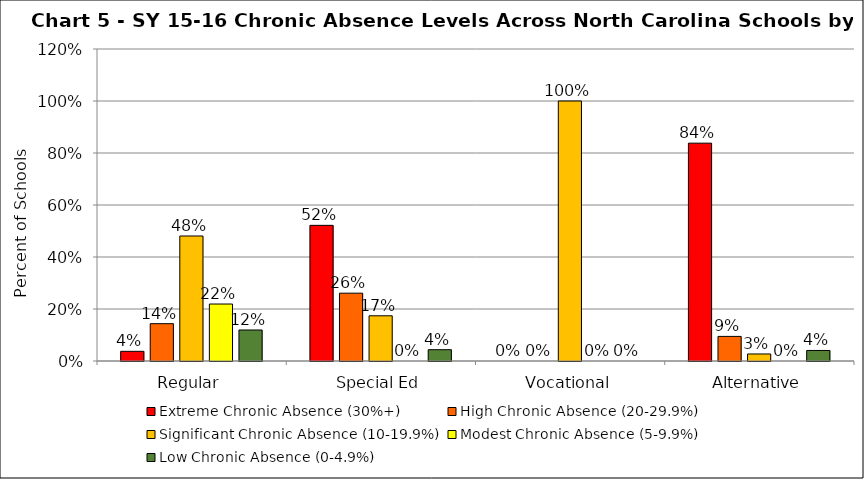
| Category | Extreme Chronic Absence (30%+) | High Chronic Absence (20-29.9%) | Significant Chronic Absence (10-19.9%) | Modest Chronic Absence (5-9.9%) | Low Chronic Absence (0-4.9%) |
|---|---|---|---|---|---|
| 0 | 0.037 | 0.144 | 0.481 | 0.219 | 0.119 |
| 1 | 0.522 | 0.261 | 0.174 | 0 | 0.043 |
| 2 | 0 | 0 | 1 | 0 | 0 |
| 3 | 0.838 | 0.095 | 0.027 | 0 | 0.041 |